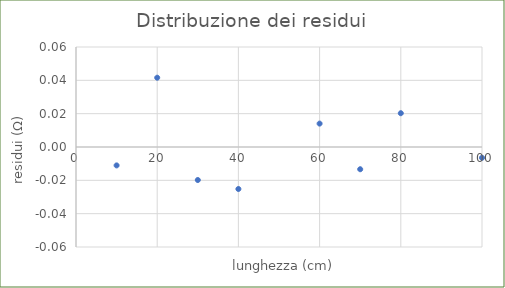
| Category | Series 0 |
|---|---|
| 10.0 | -0.011 |
| 20.0 | 0.042 |
| 30.0 | -0.02 |
| 40.0 | -0.025 |
| 60.0 | 0.014 |
| 70.0 | -0.013 |
| 80.0 | 0.02 |
| 100.0 | -0.006 |